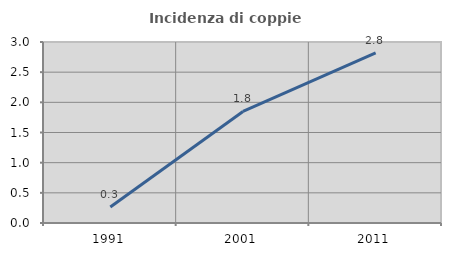
| Category | Incidenza di coppie miste |
|---|---|
| 1991.0 | 0.265 |
| 2001.0 | 1.849 |
| 2011.0 | 2.821 |